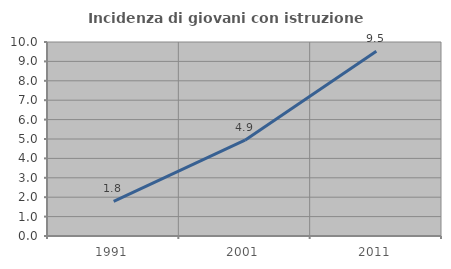
| Category | Incidenza di giovani con istruzione universitaria |
|---|---|
| 1991.0 | 1.786 |
| 2001.0 | 4.938 |
| 2011.0 | 9.524 |